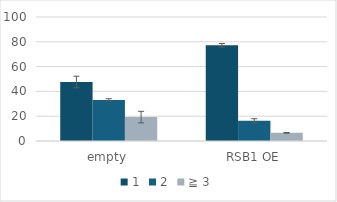
| Category | 1 | 2 | ≧ 3 |
|---|---|---|---|
| empty | 47.588 | 33.15 | 19.262 |
| RSB1 OE | 77.182 | 16.247 | 6.572 |